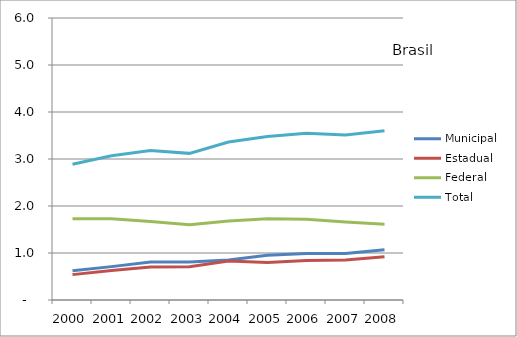
| Category | Municipal | Estadual | Federal | Total |
|---|---|---|---|---|
| 2000.0 | 0.62 | 0.54 | 1.73 | 2.89 |
| 2001.0 | 0.71 | 0.63 | 1.73 | 3.07 |
| 2002.0 | 0.81 | 0.7 | 1.67 | 3.18 |
| 2003.0 | 0.81 | 0.71 | 1.6 | 3.12 |
| 2004.0 | 0.85 | 0.83 | 1.68 | 3.36 |
| 2005.0 | 0.95 | 0.8 | 1.73 | 3.48 |
| 2006.0 | 0.99 | 0.84 | 1.72 | 3.55 |
| 2007.0 | 0.99 | 0.85 | 1.66 | 3.51 |
| 2008.0 | 1.07 | 0.92 | 1.61 | 3.6 |